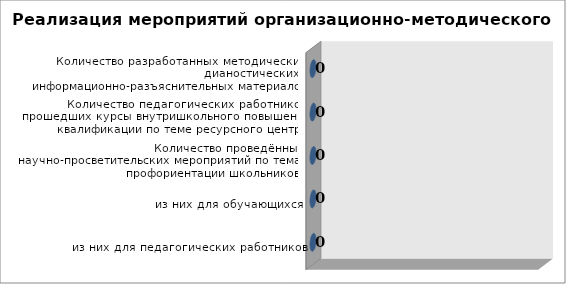
| Category | Series 0 |
|---|---|
| из них для педагогических работников | 0 |
| из них для обучающихся | 0 |
| Количество проведённых научно-просветительских мероприятий по темам профориентации школьников  | 0 |
| Количество педагогических работников, прошедших курсы внутришкольного повышения квалификации по теме ресурсного центра | 0 |
| Количество разработанных методических, дианостических, информационно-разъяснительных материалов | 0 |